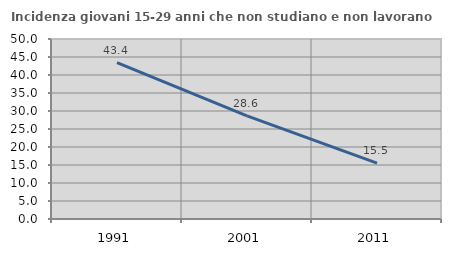
| Category | Incidenza giovani 15-29 anni che non studiano e non lavorano  |
|---|---|
| 1991.0 | 43.424 |
| 2001.0 | 28.646 |
| 2011.0 | 15.504 |